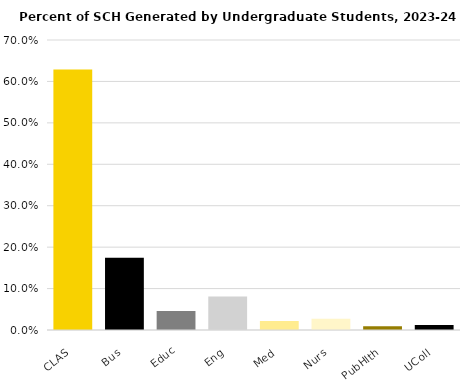
| Category | Series 0 |
|---|---|
| CLAS | 0.629 |
| Bus | 0.174 |
| Educ | 0.046 |
| Eng | 0.081 |
| Med | 0.021 |
| Nurs | 0.027 |
| PubHlth | 0.009 |
| UColl | 0.012 |